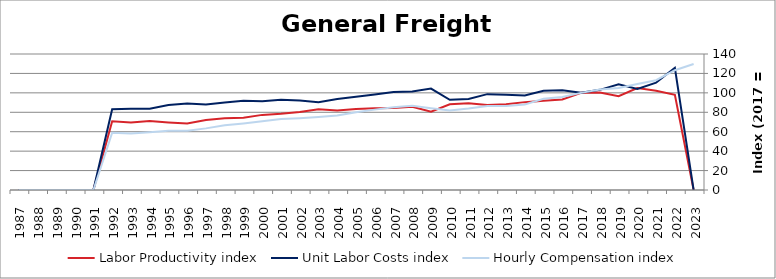
| Category | Labor Productivity index | Unit Labor Costs index | Hourly Compensation index |
|---|---|---|---|
| 2023.0 | 0 | 0 | 129.767 |
| 2022.0 | 98.036 | 125.801 | 123.331 |
| 2021.0 | 102.266 | 110.502 | 113.006 |
| 2020.0 | 104.893 | 104.066 | 109.157 |
| 2019.0 | 96.535 | 108.799 | 105.03 |
| 2018.0 | 100.268 | 103.111 | 103.387 |
| 2017.0 | 100 | 100 | 100 |
| 2016.0 | 93.25 | 102.728 | 95.794 |
| 2015.0 | 91.931 | 102.234 | 93.985 |
| 2014.0 | 90.454 | 97.373 | 88.077 |
| 2013.0 | 88.217 | 98.058 | 86.505 |
| 2012.0 | 87.55 | 98.682 | 86.396 |
| 2011.0 | 89.42 | 93.704 | 83.79 |
| 2010.0 | 88.165 | 92.865 | 81.874 |
| 2009.0 | 80.565 | 104.463 | 84.16 |
| 2008.0 | 85.597 | 101.335 | 86.739 |
| 2007.0 | 84.389 | 100.931 | 85.175 |
| 2006.0 | 84.2 | 98.267 | 82.741 |
| 2005.0 | 83.422 | 96.033 | 80.112 |
| 2004.0 | 81.895 | 93.61 | 76.662 |
| 2003.0 | 83.224 | 90.337 | 75.182 |
| 2002.0 | 80.366 | 92.007 | 73.943 |
| 2001.0 | 78.6 | 92.984 | 73.085 |
| 2000.0 | 77.332 | 91.388 | 70.672 |
| 1999.0 | 74.455 | 91.937 | 68.452 |
| 1998.0 | 73.838 | 90.147 | 66.563 |
| 1997.0 | 72.076 | 88.022 | 63.443 |
| 1996.0 | 68.385 | 89.023 | 60.879 |
| 1995.0 | 69.595 | 87.521 | 60.91 |
| 1994.0 | 71.149 | 83.608 | 59.486 |
| 1993.0 | 69.564 | 83.65 | 58.19 |
| 1992.0 | 70.784 | 83.174 | 58.874 |
| 1991.0 | 0 | 0 | 0 |
| 1990.0 | 0 | 0 | 0 |
| 1989.0 | 0 | 0 | 0 |
| 1988.0 | 0 | 0 | 0 |
| 1987.0 | 0 | 0 | 0 |